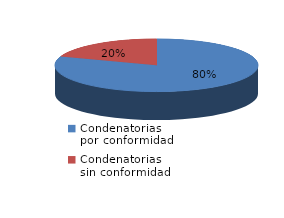
| Category | Series 0 |
|---|---|
| 0 | 214 |
| 1 | 52 |